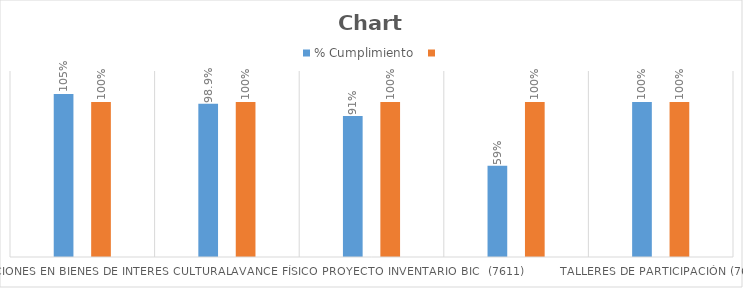
| Category | % Cumplimiento  | Series 1 |
|---|---|---|
| Intervenciones en Bienes de Interes Cultural  | 1.052 | 1 |
| Oportunidad en la atención de los tramites  | 0.989 | 1 |
| Avance físico proyecto Inventario BIC  (7611) | 0.91 | 1 |
| Avance físico proyecto columbarios (7612) | 0.588 | 1 |
| Talleres de participación (7612) | 1 | 1 |